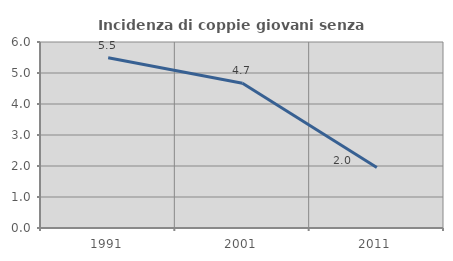
| Category | Incidenza di coppie giovani senza figli |
|---|---|
| 1991.0 | 5.49 |
| 2001.0 | 4.669 |
| 2011.0 | 1.953 |